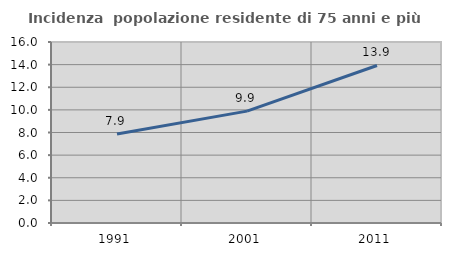
| Category | Incidenza  popolazione residente di 75 anni e più |
|---|---|
| 1991.0 | 7.861 |
| 2001.0 | 9.888 |
| 2011.0 | 13.925 |